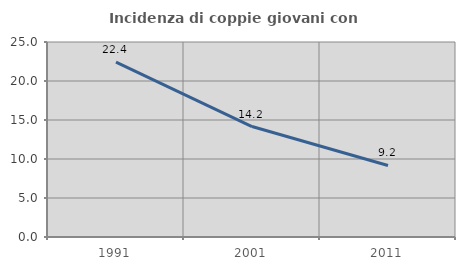
| Category | Incidenza di coppie giovani con figli |
|---|---|
| 1991.0 | 22.417 |
| 2001.0 | 14.161 |
| 2011.0 | 9.171 |